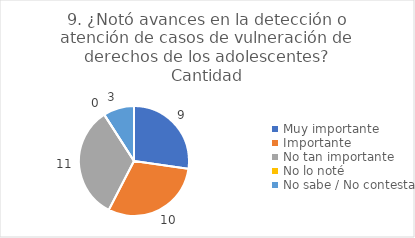
| Category | 9. ¿Notó avances en la detección o atención de casos de vulneración de derechos de los adolescentes? |
|---|---|
| Muy importante  | 0.273 |
| Importante  | 0.303 |
| No tan importante  | 0.333 |
| No lo noté  | 0 |
| No sabe / No contesta | 0.091 |